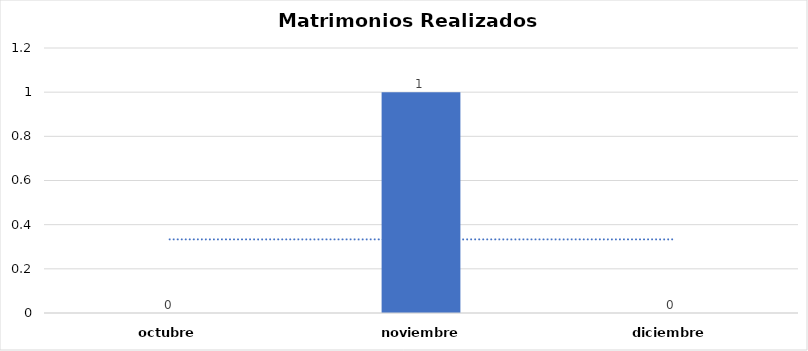
| Category | Series 0 |
|---|---|
| octubre | 0 |
| noviembre  | 1 |
| diciembre | 0 |